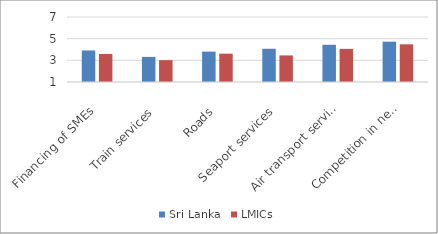
| Category | Sri Lanka | LMICs |
|---|---|---|
| Financing of SMEs | 3.911 | 3.583 |
| Train services | 3.316 | 3.015 |
| Roads | 3.804 | 3.616 |
| Seaport services | 4.066 | 3.454 |
| Air transport services | 4.436 | 4.06 |
| Competition in network services | 4.721 | 4.478 |